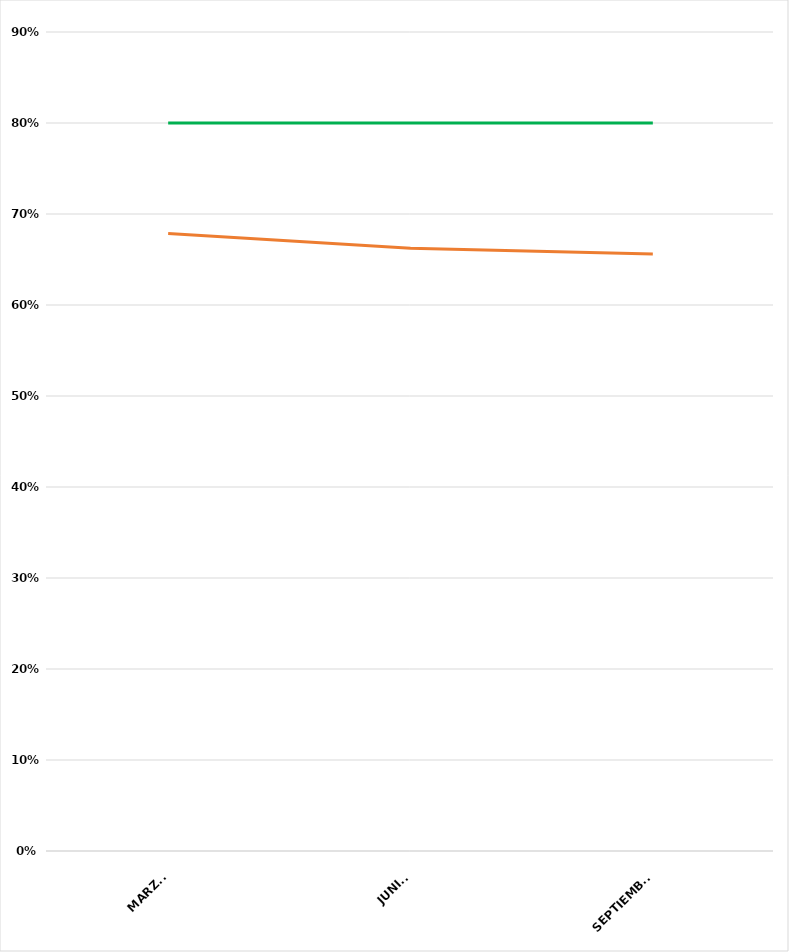
| Category | VALOR  | META PONDERADA |
|---|---|---|
| MARZO | 0.678 | 0.8 |
| JUNIO | 0.662 | 0.8 |
| SEPTIEMBRE | 0.656 | 0.8 |